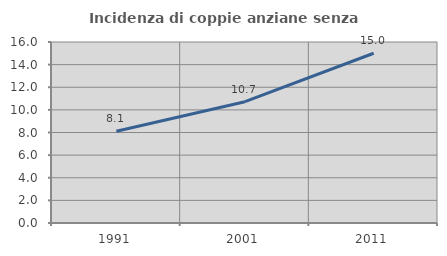
| Category | Incidenza di coppie anziane senza figli  |
|---|---|
| 1991.0 | 8.118 |
| 2001.0 | 10.724 |
| 2011.0 | 15.005 |